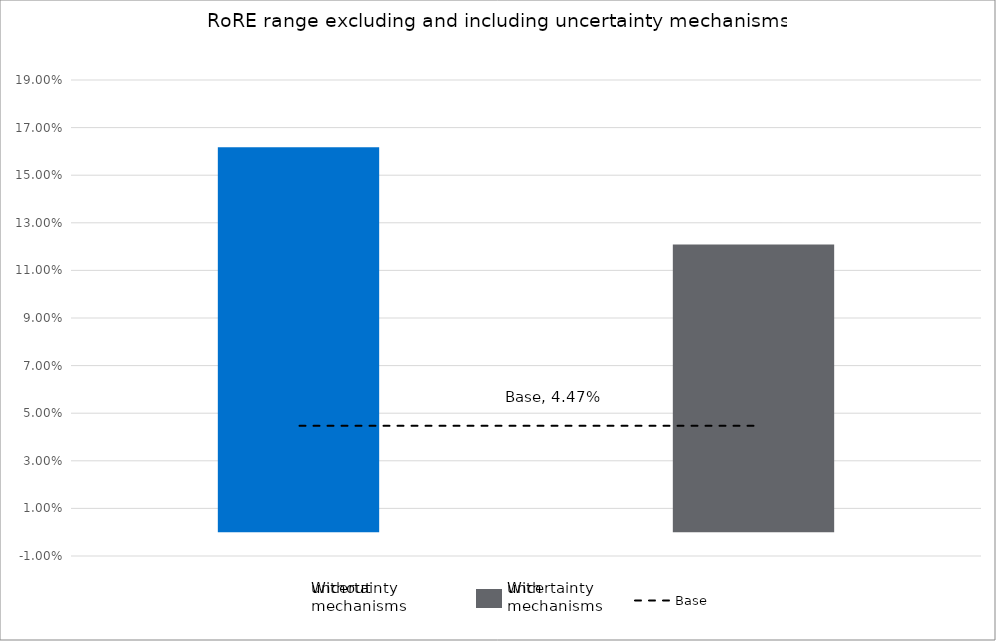
| Category | Low case | High case |
|---|---|---|
| Without uncertainty | -0.07 | 0.162 |
| Without uncertainty | -0.038 | 0.121 |